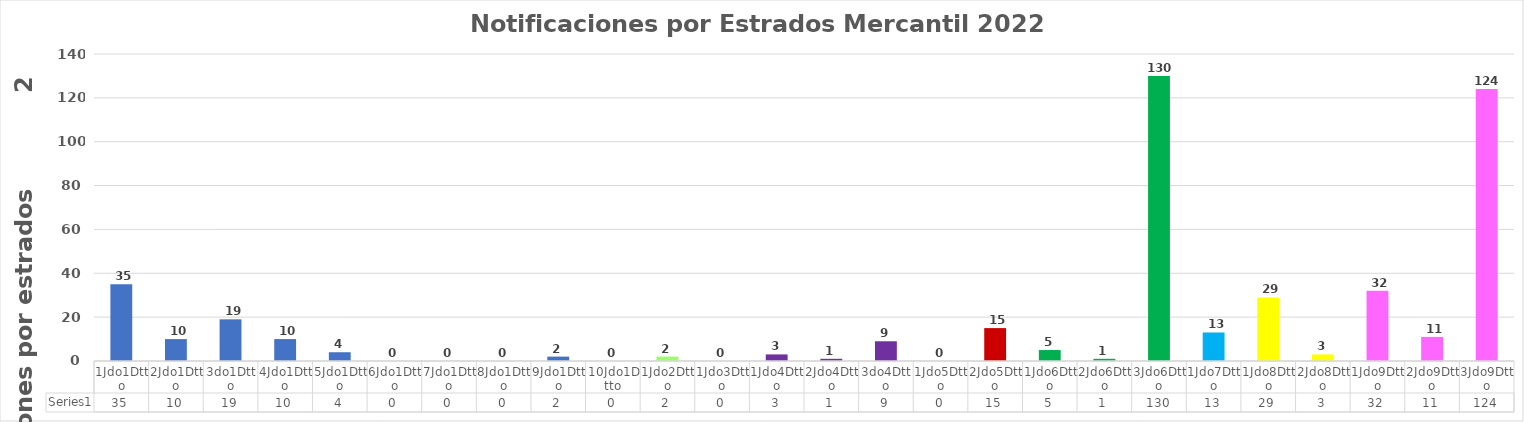
| Category | Series 0 |
|---|---|
| 1Jdo1Dtto | 35 |
| 2Jdo1Dtto | 10 |
| 3do1Dtto | 19 |
| 4Jdo1Dtto | 10 |
| 5Jdo1Dtto | 4 |
| 6Jdo1Dtto | 0 |
| 7Jdo1Dtto | 0 |
| 8Jdo1Dtto | 0 |
| 9Jdo1Dtto | 2 |
| 10Jdo1Dtto | 0 |
| 1Jdo2Dtto | 2 |
| 1Jdo3Dtto | 0 |
| 1Jdo4Dtto | 3 |
| 2Jdo4Dtto | 1 |
| 3do4Dtto | 9 |
| 1Jdo5Dtto | 0 |
| 2Jdo5Dtto | 15 |
| 1Jdo6Dtto | 5 |
| 2Jdo6Dtto | 1 |
| 3Jdo6Dtto | 130 |
| 1Jdo7Dtto | 13 |
| 1Jdo8Dtto | 29 |
| 2Jdo8Dtto | 3 |
| 1Jdo9Dtto | 32 |
| 2Jdo9Dtto | 11 |
| 3Jdo9Dtto | 124 |